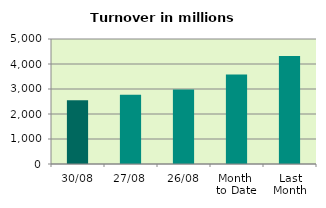
| Category | Series 0 |
|---|---|
| 30/08 | 2545.248 |
| 27/08 | 2769.205 |
| 26/08 | 2980.674 |
| Month 
to Date | 3578.713 |
| Last
Month | 4319.965 |